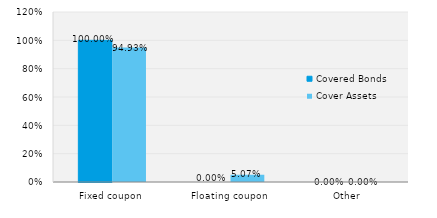
| Category | Covered Bonds | Cover Assets |
|---|---|---|
| Fixed coupon | 1 | 0.949 |
| Floating coupon | 0 | 0.051 |
| Other | 0 | 0 |